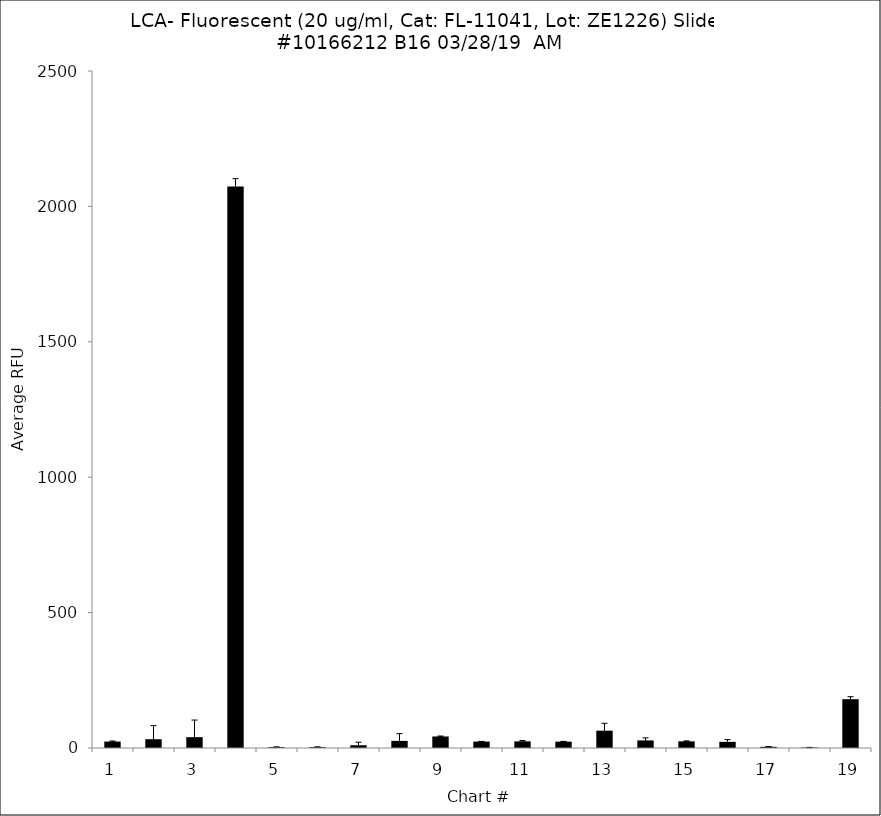
| Category | Series 0 |
|---|---|
| 1.0 | 23.75 |
| 2.0 | 32.5 |
| 3.0 | 40 |
| 4.0 | 2073.5 |
| 5.0 | 3.25 |
| 6.0 | 3.25 |
| 7.0 | 10.25 |
| 8.0 | 26.25 |
| 9.0 | 42.5 |
| 10.0 | 23.75 |
| 11.0 | 24.5 |
| 12.0 | 23.5 |
| 13.0 | 64 |
| 14.0 | 28 |
| 15.0 | 24.5 |
| 16.0 | 22.75 |
| 17.0 | 4.333 |
| 18.0 | 1.75 |
| 19.0 | 180.25 |